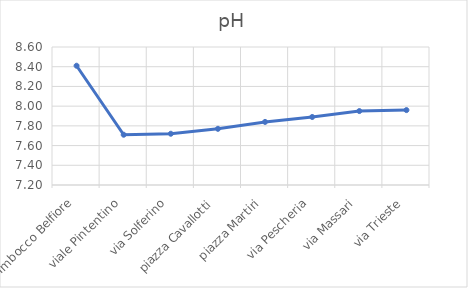
| Category |  pH |
|---|---|
| Imbocco Belfiore | 8.41 |
| viale Pintentino | 7.71 |
| via Solferino | 7.72 |
| piazza Cavallotti | 7.77 |
| piazza Martiri | 7.84 |
| via Pescheria | 7.89 |
| via Massari | 7.95 |
| via Trieste | 7.96 |